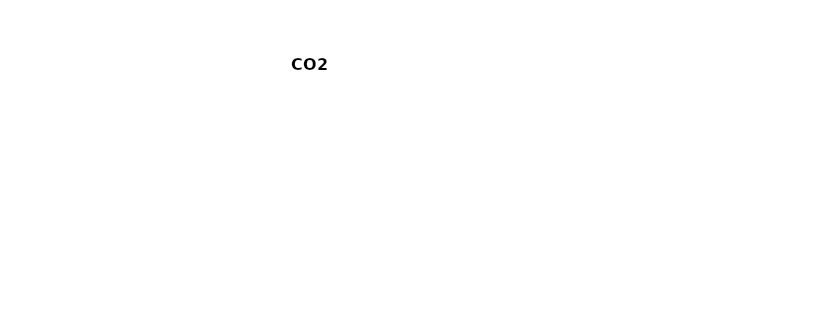
| Category | Series 0 |
|---|---|
| Vehicle 1 | 0 |
|  | 0 |
|  | 0 |
|  | 0 |
| kWh | 0 |
| Gas | 0 |
| Flights | 0 |
| Garbage | 0 |